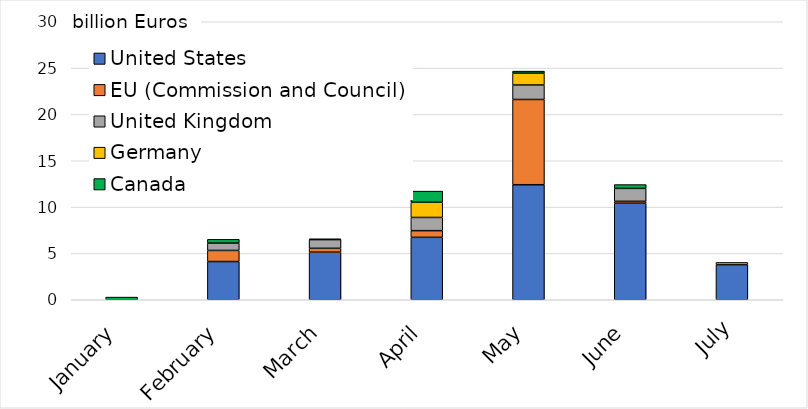
| Category | United States | EU (Commission and Council) | United Kingdom | Germany | Canada |
|---|---|---|---|---|---|
| January | 0 | 0 | 0 | 0 | 0.288 |
| February | 4.123 | 1.2 | 0.794 | 0 | 0.404 |
| March | 5.137 | 0.415 | 0.938 | 0 | 0.083 |
| April | 6.737 | 0.72 | 1.425 | 1.64 | 1.202 |
| May | 12.413 | 9.2 | 1.563 | 1.275 | 0.223 |
| June | 10.417 | 0.205 | 1.399 | 0 | 0.41 |
| July | 3.788 | 0 | 0 | 0.24 | 0 |